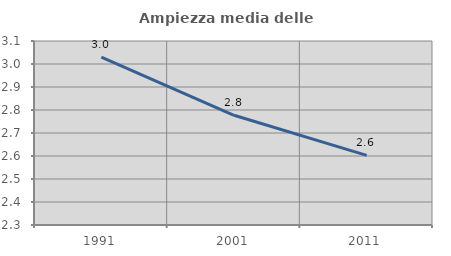
| Category | Ampiezza media delle famiglie |
|---|---|
| 1991.0 | 3.03 |
| 2001.0 | 2.777 |
| 2011.0 | 2.602 |